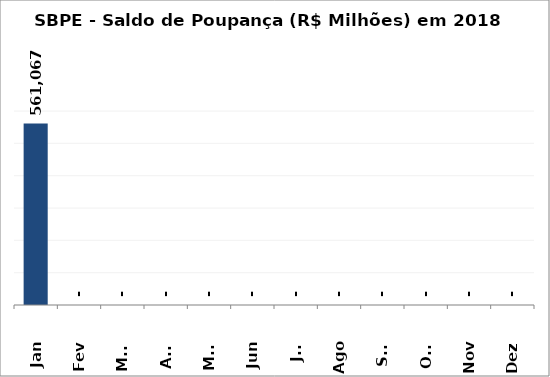
| Category | SBPE - Saldo de Poupança (R$ Milhões) em 2018 |
|---|---|
| Jan | 561067.029 |
| Fev | 0 |
| Mar | 0 |
| Abr | 0 |
| Mai | 0 |
| Jun | 0 |
| Jul | 0 |
| Ago | 0 |
| Set | 0 |
| Out | 0 |
| Nov | 0 |
| Dez | 0 |